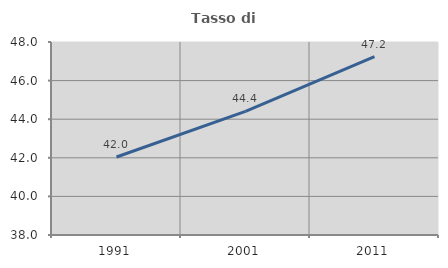
| Category | Tasso di occupazione   |
|---|---|
| 1991.0 | 42.043 |
| 2001.0 | 44.408 |
| 2011.0 | 47.245 |